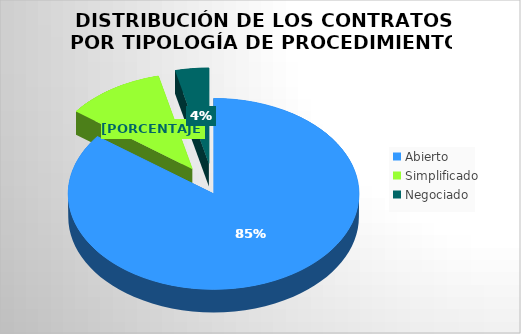
| Category | Importe adjudicado | Porcentaje |
|---|---|---|
| Abierto | 5235146.572 | 0.853 |
| Simplificado | 675694.47 | 0.11 |
| Negociado | 229706.62 | 0.037 |